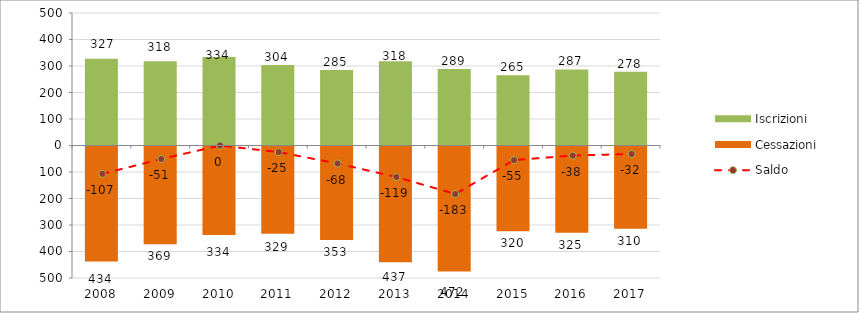
| Category | Iscrizioni | Cessazioni |
|---|---|---|
| 2008.0 | 327 | -434 |
| 2009.0 | 318 | -369 |
| 2010.0 | 334 | -334 |
| 2011.0 | 304 | -329 |
| 2012.0 | 285 | -353 |
| 2013.0 | 318 | -437 |
| 2014.0 | 289 | -472 |
| 2015.0 | 265 | -320 |
| 2016.0 | 287 | -325 |
| 2017.0 | 278 | -310 |